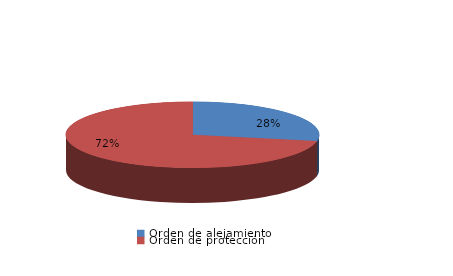
| Category | Series 0 |
|---|---|
| Orden de alejamiento | 7 |
| Orden de protección | 18 |